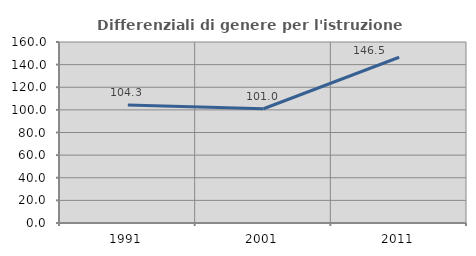
| Category | Differenziali di genere per l'istruzione superiore |
|---|---|
| 1991.0 | 104.334 |
| 2001.0 | 101.012 |
| 2011.0 | 146.504 |